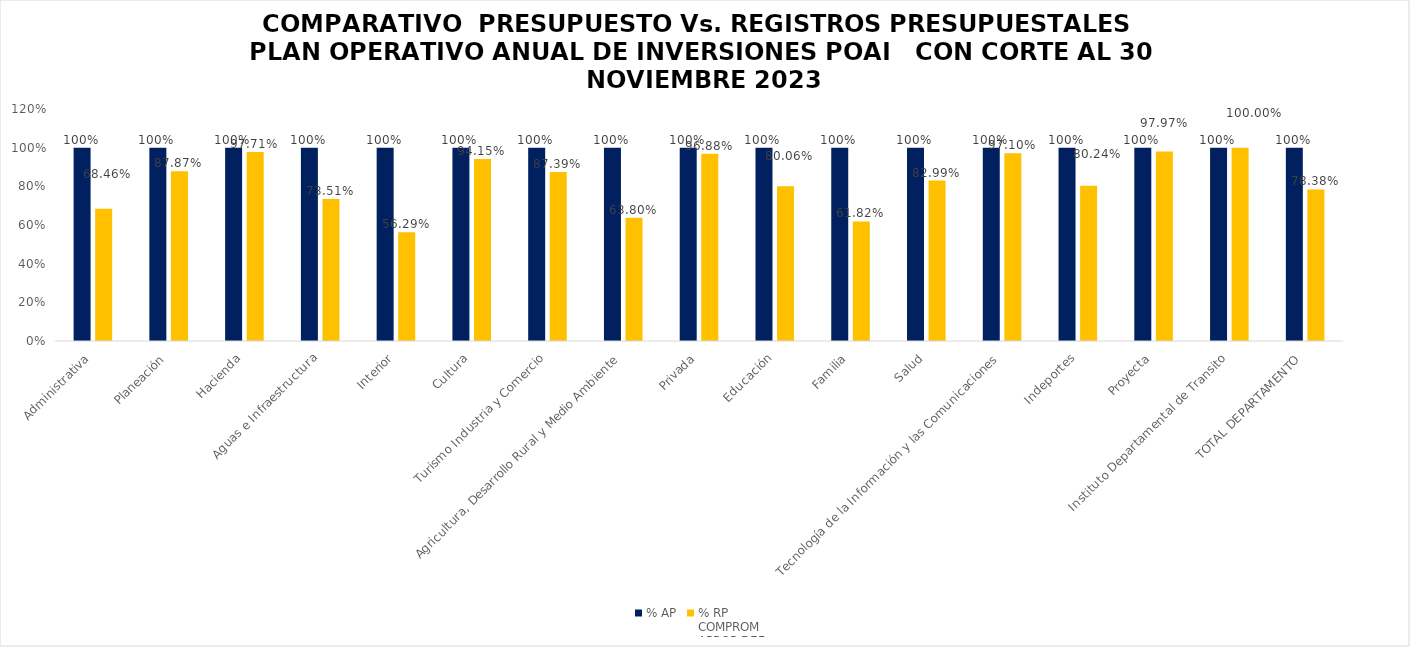
| Category | % AP | % RP
COMPROM
APROP DEF |
|---|---|---|
| Administrativa | 1 | 0.685 |
| Planeación | 1 | 0.879 |
| Hacienda | 1 | 0.977 |
| Aguas e Infraestructura | 1 | 0.735 |
| Interior | 1 | 0.563 |
| Cultura | 1 | 0.942 |
| Turismo Industria y Comercio | 1 | 0.874 |
| Agricultura, Desarrollo Rural y Medio Ambiente | 1 | 0.638 |
| Privada | 1 | 0.969 |
| Educación | 1 | 0.801 |
| Familia | 1 | 0.618 |
| Salud | 1 | 0.83 |
| Tecnología de la Información y las Comunicaciones | 1 | 0.971 |
| Indeportes | 1 | 0.802 |
| Proyecta | 1 | 0.98 |
| Instituto Departamental de Transito | 1 | 1 |
| TOTAL DEPARTAMENTO | 1 | 0.784 |